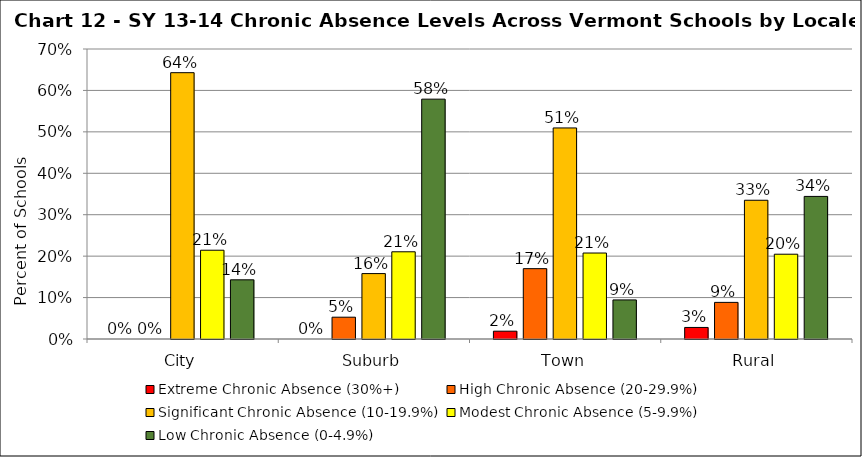
| Category | Extreme Chronic Absence (30%+) | High Chronic Absence (20-29.9%) | Significant Chronic Absence (10-19.9%) | Modest Chronic Absence (5-9.9%) | Low Chronic Absence (0-4.9%) |
|---|---|---|---|---|---|
| 0 | 0 | 0 | 0.643 | 0.214 | 0.143 |
| 1 | 0 | 0.053 | 0.158 | 0.211 | 0.579 |
| 2 | 0.019 | 0.17 | 0.509 | 0.208 | 0.094 |
| 3 | 0.028 | 0.088 | 0.335 | 0.205 | 0.344 |